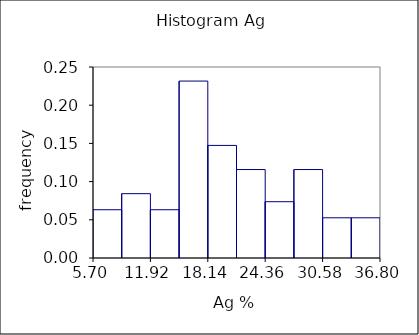
| Category | Series 0 |
|---|---|
| 5.7 | 0 |
| 5.7 | 0.063 |
| 8.81 | 0.063 |
| 8.81 | 0 |
| 8.81 | 0 |
| 8.81 | 0.084 |
| 11.92 | 0.084 |
| 11.92 | 0 |
| 11.92 | 0 |
| 11.92 | 0.063 |
| 15.03 | 0.063 |
| 15.03 | 0 |
| 15.03 | 0 |
| 15.03 | 0.232 |
| 18.14 | 0.232 |
| 18.14 | 0 |
| 18.14 | 0 |
| 18.14 | 0.147 |
| 21.25 | 0.147 |
| 21.25 | 0 |
| 21.25 | 0 |
| 21.25 | 0.116 |
| 24.36 | 0.116 |
| 24.36 | 0 |
| 24.36 | 0 |
| 24.36 | 0.074 |
| 27.47 | 0.074 |
| 27.47 | 0 |
| 27.47 | 0 |
| 27.47 | 0.116 |
| 30.58 | 0.116 |
| 30.58 | 0 |
| 30.58 | 0 |
| 30.58 | 0.053 |
| 33.69 | 0.053 |
| 33.69 | 0 |
| 33.69 | 0 |
| 33.69 | 0.053 |
| 36.8 | 0.053 |
| 36.8 | 0 |